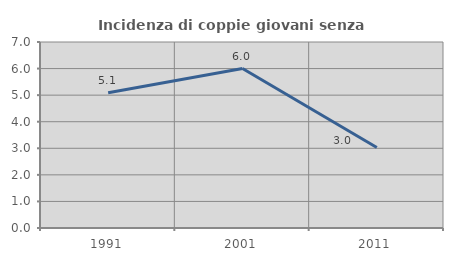
| Category | Incidenza di coppie giovani senza figli |
|---|---|
| 1991.0 | 5.093 |
| 2001.0 | 6 |
| 2011.0 | 3.03 |